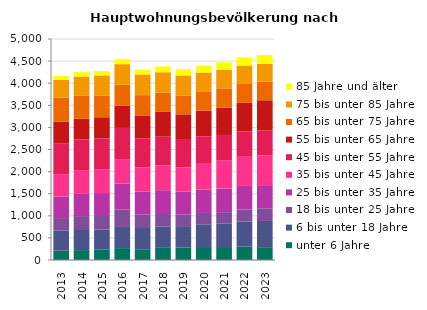
| Category | unter 6 Jahre | 6 bis unter 18 Jahre | 18 bis unter 25 Jahre | 25 bis unter 35 Jahre | 35 bis unter 45 Jahre | 45 bis unter 55 Jahre | 55 bis unter 65 Jahre | 65 bis unter 75 Jahre | 75 bis unter 85 Jahre | 85 Jahre und älter |
|---|---|---|---|---|---|---|---|---|---|---|
| 2013.0 | 212 | 455 | 281 | 485 | 509 | 701 | 482 | 545 | 407 | 83 |
| 2014.0 | 224 | 455 | 314 | 503 | 524 | 707 | 473 | 524 | 425 | 101 |
| 2015.0 | 233 | 455 | 308 | 518 | 530 | 704 | 482 | 494 | 452 | 98 |
| 2016.0 | 269 | 497 | 377 | 587 | 554 | 704 | 506 | 470 | 467 | 113 |
| 2017.0 | 242 | 482 | 308 | 515 | 548 | 656 | 521 | 458 | 467 | 113 |
| 2018.0 | 275 | 485 | 281 | 539 | 563 | 647 | 560 | 437 | 461 | 131 |
| 2019.0 | 281 | 485 | 266 | 515 | 548 | 623 | 578 | 428 | 452 | 143 |
| 2020.0 | 293 | 515 | 257 | 527 | 602 | 605 | 581 | 437 | 425 | 158 |
| 2021.0 | 293 | 536 | 254 | 533 | 632 | 581 | 614 | 440 | 419 | 170 |
| 2022.0 | 302 | 569 | 269 | 536 | 659 | 578 | 650 | 434 | 401 | 185 |
| 2023.0 | 290 | 593 | 287 | 524 | 674 | 566 | 680 | 422 | 404 | 194 |